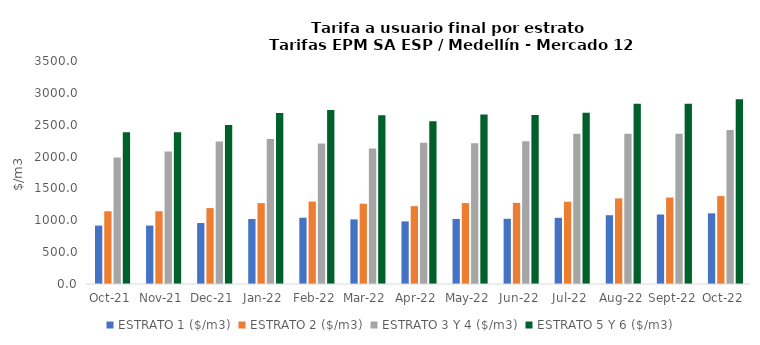
| Category | ESTRATO 1 ($/m3) | ESTRATO 2 ($/m3) | ESTRATO 3 Y 4 ($/m3) | ESTRATO 5 Y 6 ($/m3) |
|---|---|---|---|---|
| 2021-10-01 | 917.11 | 1141.45 | 1985.19 | 2382.228 |
| 2021-11-01 | 917.34 | 1141.04 | 2080.16 | 2382.228 |
| 2021-12-01 | 956.83 | 1190.98 | 2235.75 | 2496.192 |
| 2022-01-01 | 1019.7 | 1269.4 | 2276.07 | 2682.9 |
| 2022-02-01 | 1039.99 | 1293.91 | 2206.46 | 2731.284 |
| 2022-03-01 | 1013.84 | 1260.57 | 2127.67 | 2647.752 |
| 2022-04-01 | 982.96 | 1222.1 | 2218.47 | 2553.204 |
| 2022-05-01 | 1021.15 | 1269.88 | 2210.16 | 2662.164 |
| 2022-06-01 | 1023.53 | 1273.16 | 2240.82 | 2652.192 |
| 2022-07-01 | 1038.48 | 1290.79 | 2358.44 | 2688.984 |
| 2022-08-01 | 1079.67 | 1343.67 | 2358.44 | 2830.128 |
| 2022-09-01 | 1090.78 | 1357.5 | 2358.44 | 2830.128 |
| 2022-10-01 | 1109.09 | 1379.51 | 2416.46 | 2899.752 |